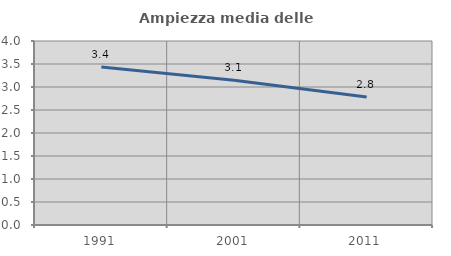
| Category | Ampiezza media delle famiglie |
|---|---|
| 1991.0 | 3.436 |
| 2001.0 | 3.149 |
| 2011.0 | 2.783 |